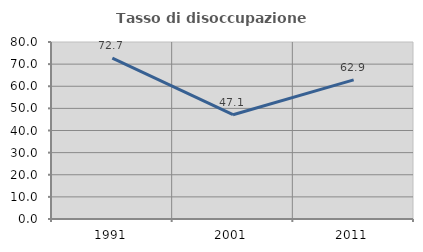
| Category | Tasso di disoccupazione giovanile  |
|---|---|
| 1991.0 | 72.704 |
| 2001.0 | 47.126 |
| 2011.0 | 62.893 |